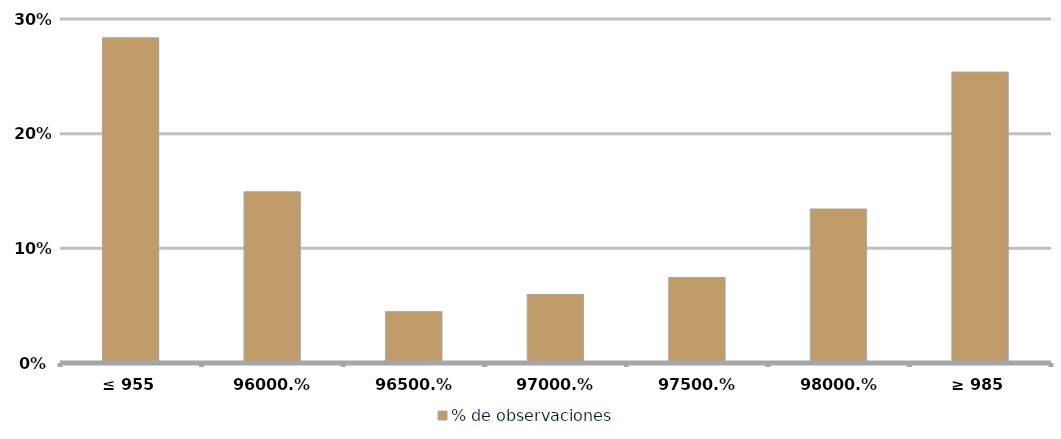
| Category | % de observaciones  |
|---|---|
| ≤ 955 | 0.284 |
| 960 | 0.149 |
| 965 | 0.045 |
| 970 | 0.06 |
| 975 | 0.075 |
| 980 | 0.134 |
| ≥ 985 | 0.254 |